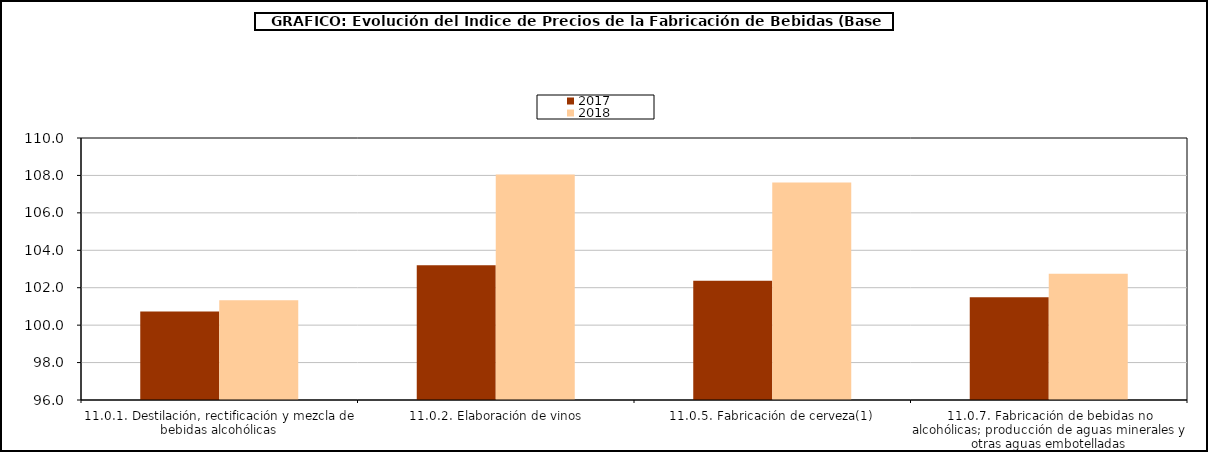
| Category | 2017 | 2018 |
|---|---|---|
| 11.0.1. Destilación, rectificación y mezcla de bebidas alcohólicas | 100.724 | 101.329 |
| 11.0.2. Elaboración de vinos | 103.203 | 108.056 |
| 11.0.5. Fabricación de cerveza(1) | 102.376 | 107.628 |
| 11.0.7. Fabricación de bebidas no alcohólicas; producción de aguas minerales y otras aguas embotelladas | 101.496 | 102.752 |